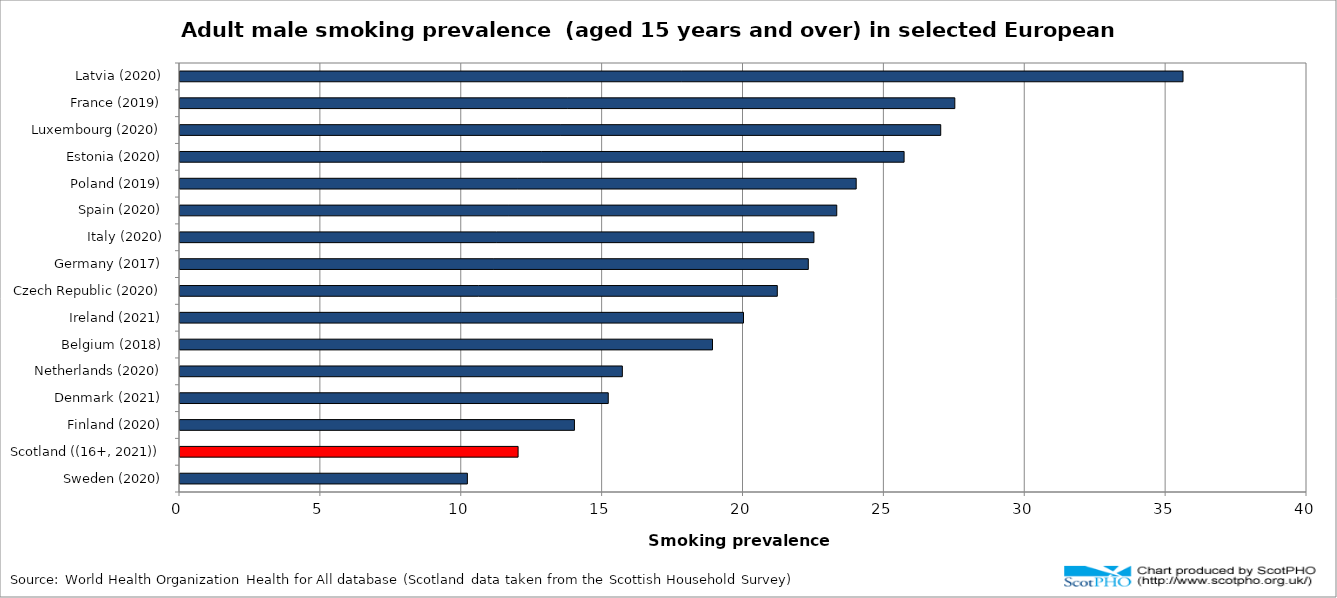
| Category | % |
|---|---|
| Sweden (2020) | 10.2 |
| Scotland ((16+, 2021)) | 12 |
| Finland (2020) | 14 |
| Denmark (2021) | 15.2 |
| Netherlands (2020) | 15.7 |
| Belgium (2018) | 18.9 |
| Ireland (2021) | 20 |
| Czech Republic (2020) | 21.2 |
| Germany (2017) | 22.3 |
| Italy (2020) | 22.5 |
| Spain (2020) | 23.31 |
| Poland (2019) | 24 |
| Estonia (2020) | 25.7 |
| Luxembourg (2020) | 27 |
| France (2019) | 27.5 |
| Latvia (2020) | 35.6 |